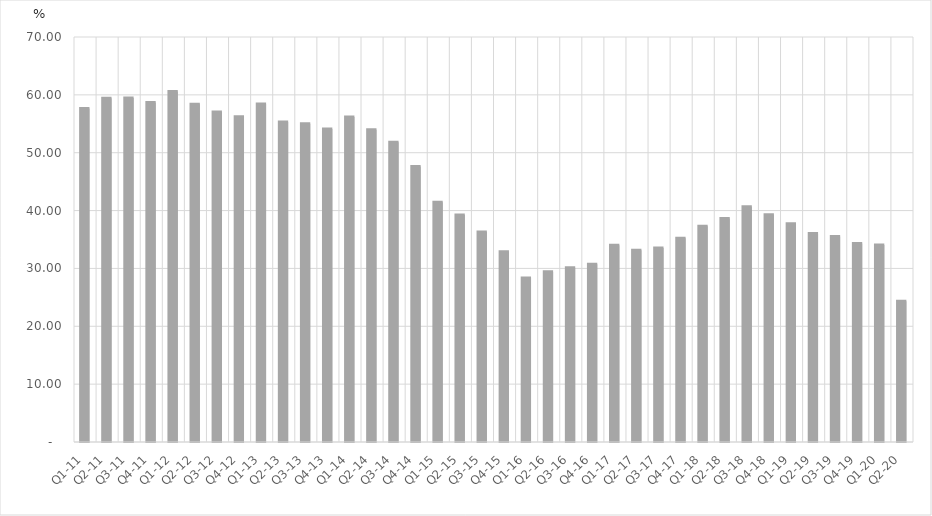
| Category | Percent of Total GDP |
|---|---|
| Q1-11 | 57.631 |
| Q2-11 | 59.399 |
| Q3-11 | 59.453 |
| Q4-11 | 58.671 |
| Q1-12 | 60.56 |
| Q2-12 | 58.396 |
| Q3-12 | 57.038 |
| Q4-12 | 56.204 |
| Q1-13 | 58.424 |
| Q2-13 | 55.307 |
| Q3-13 | 55.006 |
| Q4-13 | 54.088 |
| Q1-14 | 56.163 |
| Q2-14 | 53.956 |
| Q3-14 | 51.811 |
| Q4-14 | 47.617 |
| Q1-15 | 41.418 |
| Q2-15 | 39.238 |
| Q3-15 | 36.285 |
| Q4-15 | 32.901 |
| Q1-16 | 28.334 |
| Q2-16 | 29.447 |
| Q3-16 | 30.13 |
| Q4-16 | 30.707 |
| Q1-17 | 33.991 |
| Q2-17 | 33.157 |
| Q3-17 | 33.536 |
| Q4-17 | 35.228 |
| Q1-18 | 37.277 |
| Q2-18 | 38.632 |
| Q3-18 | 40.658 |
| Q4-18 | 39.257 |
| Q1-19 | 37.717 |
| Q2-19 | 36.027 |
| Q3-19 | 35.507 |
| Q4-19 | 34.33 |
| Q1-20 | 34.068 |
| Q2-20 | 24.326 |